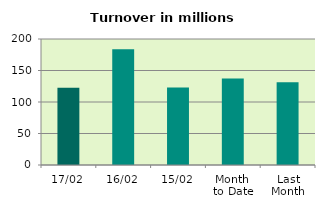
| Category | Series 0 |
|---|---|
| 17/02 | 122.527 |
| 16/02 | 183.745 |
| 15/02 | 123.042 |
| Month 
to Date | 137.48 |
| Last
Month | 131.402 |